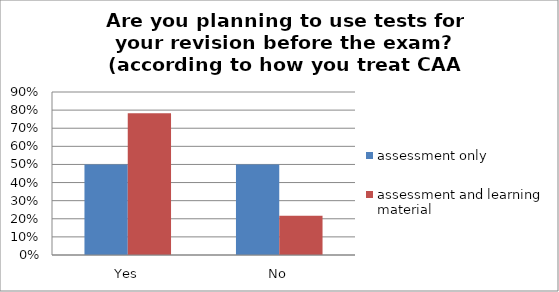
| Category | assessment only | assessment and learning material |
|---|---|---|
| Yes | 0.5 | 0.783 |
| No | 0.5 | 0.217 |